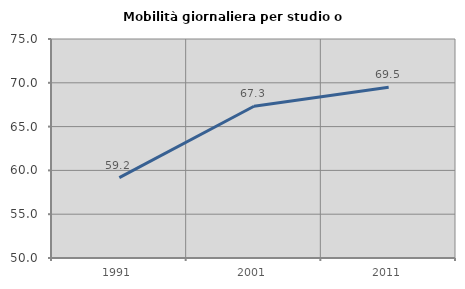
| Category | Mobilità giornaliera per studio o lavoro |
|---|---|
| 1991.0 | 59.175 |
| 2001.0 | 67.328 |
| 2011.0 | 69.502 |